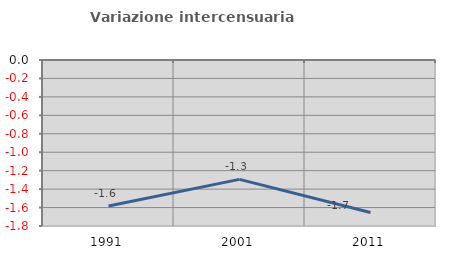
| Category | Variazione intercensuaria annua |
|---|---|
| 1991.0 | -1.583 |
| 2001.0 | -1.294 |
| 2011.0 | -1.654 |